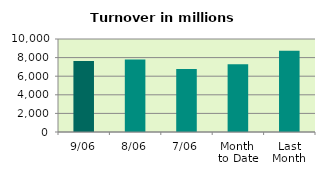
| Category | Series 0 |
|---|---|
| 9/06 | 7644.974 |
| 8/06 | 7798.803 |
| 7/06 | 6768.222 |
| Month 
to Date | 7292.914 |
| Last
Month | 8745.898 |